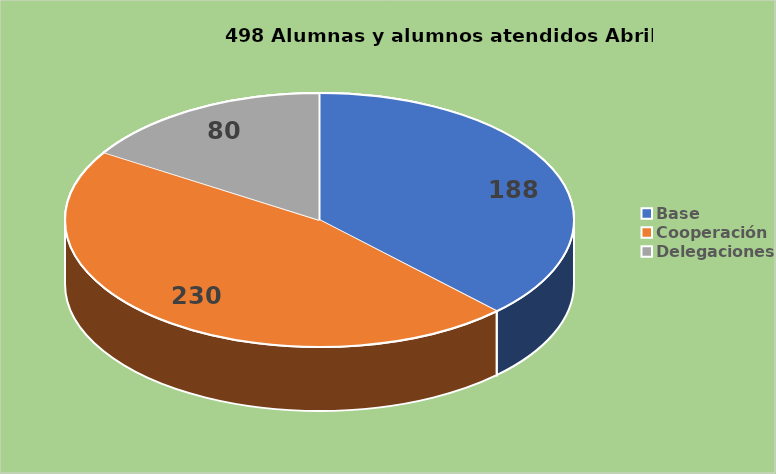
| Category | Series 0 |
|---|---|
| Base | 188 |
| Cooperación | 230 |
| Delegaciones | 80 |